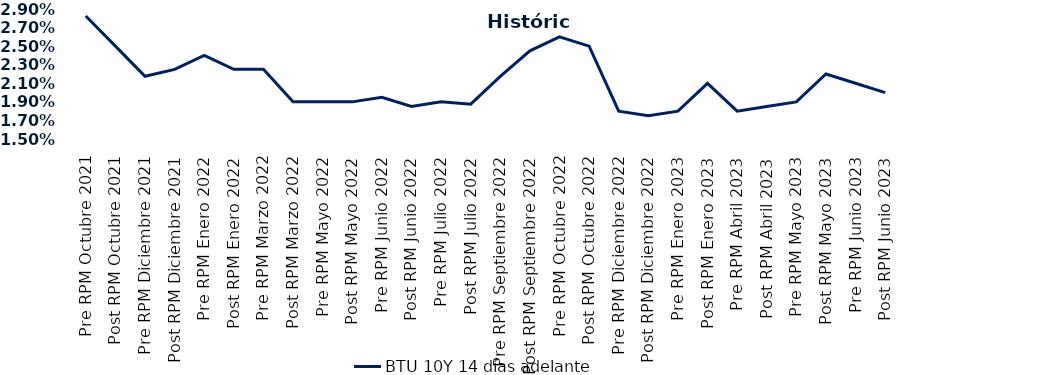
| Category | BTU 10Y 14 días adelante |
|---|---|
| Pre RPM Octubre 2021 | 0.028 |
| Post RPM Octubre 2021 | 0.025 |
| Pre RPM Diciembre 2021 | 0.022 |
| Post RPM Diciembre 2021 | 0.022 |
| Pre RPM Enero 2022 | 0.024 |
| Post RPM Enero 2022 | 0.022 |
| Pre RPM Marzo 2022 | 0.022 |
| Post RPM Marzo 2022 | 0.019 |
| Pre RPM Mayo 2022 | 0.019 |
| Post RPM Mayo 2022 | 0.019 |
| Pre RPM Junio 2022 | 0.02 |
| Post RPM Junio 2022 | 0.018 |
| Pre RPM Julio 2022 | 0.019 |
| Post RPM Julio 2022 | 0.019 |
| Pre RPM Septiembre 2022 | 0.022 |
| Post RPM Septiembre 2022 | 0.024 |
| Pre RPM Octubre 2022 | 0.026 |
| Post RPM Octubre 2022 | 0.025 |
| Pre RPM Diciembre 2022 | 0.018 |
| Post RPM Diciembre 2022 | 0.018 |
| Pre RPM Enero 2023 | 0.018 |
| Post RPM Enero 2023 | 0.021 |
| Pre RPM Abril 2023 | 0.018 |
| Post RPM Abril 2023 | 0.018 |
| Pre RPM Mayo 2023 | 0.019 |
| Post RPM Mayo 2023 | 0.022 |
| Pre RPM Junio 2023 | 0.021 |
| Post RPM Junio 2023 | 0.02 |